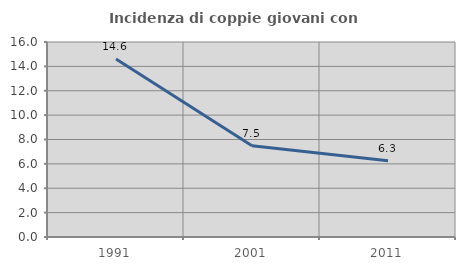
| Category | Incidenza di coppie giovani con figli |
|---|---|
| 1991.0 | 14.603 |
| 2001.0 | 7.488 |
| 2011.0 | 6.265 |